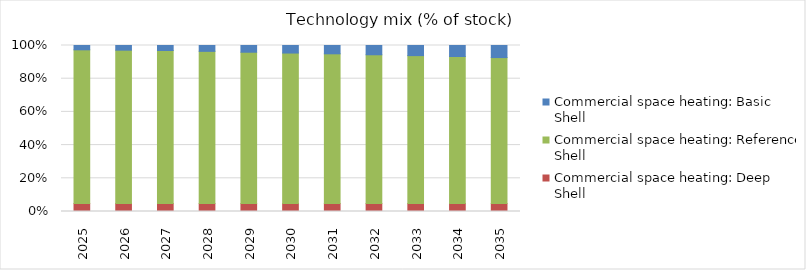
| Category | Commercial space heating: Deep Shell | Commercial space heating: Reference Shell | Commercial space heating: Basic Shell |
|---|---|---|---|
| 2025.0 | 0.048 | 0.926 | 0.026 |
| 2026.0 | 0.048 | 0.924 | 0.028 |
| 2027.0 | 0.048 | 0.922 | 0.03 |
| 2028.0 | 0.048 | 0.917 | 0.035 |
| 2029.0 | 0.048 | 0.912 | 0.041 |
| 2030.0 | 0.048 | 0.907 | 0.045 |
| 2031.0 | 0.048 | 0.902 | 0.05 |
| 2032.0 | 0.048 | 0.896 | 0.056 |
| 2033.0 | 0.048 | 0.891 | 0.061 |
| 2034.0 | 0.048 | 0.886 | 0.066 |
| 2035.0 | 0.048 | 0.879 | 0.073 |